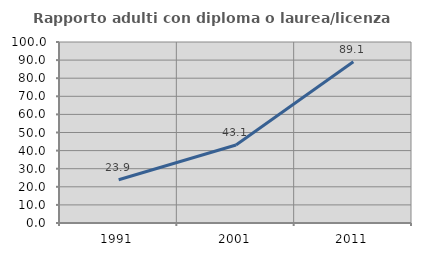
| Category | Rapporto adulti con diploma o laurea/licenza media  |
|---|---|
| 1991.0 | 23.868 |
| 2001.0 | 43.123 |
| 2011.0 | 89.069 |